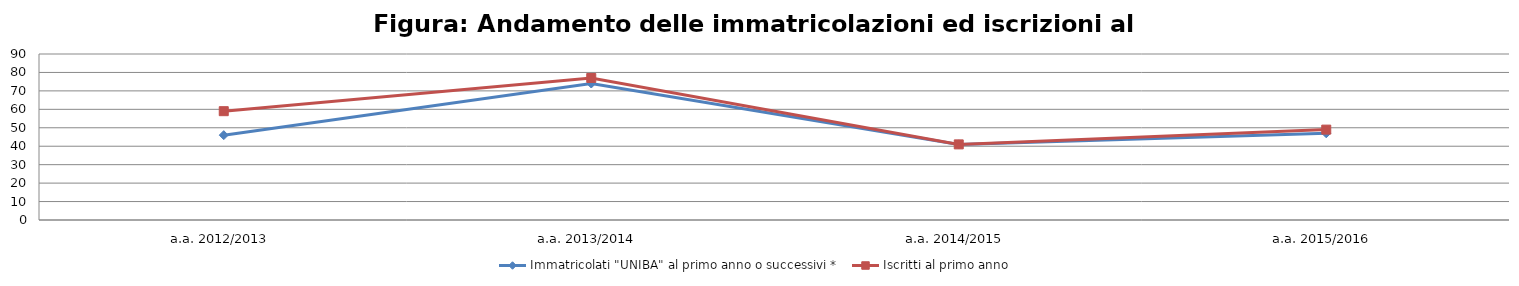
| Category | Immatricolati "UNIBA" al primo anno o successivi * | Iscritti al primo anno  |
|---|---|---|
| a.a. 2012/2013 | 46 | 59 |
| a.a. 2013/2014 | 74 | 77 |
| a.a. 2014/2015 | 41 | 41 |
| a.a. 2015/2016 | 47 | 49 |